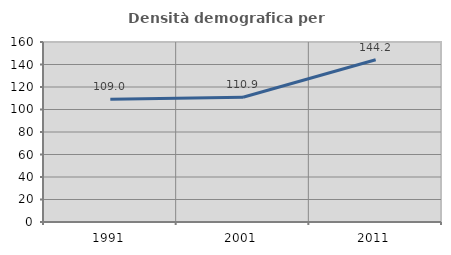
| Category | Densità demografica |
|---|---|
| 1991.0 | 109.007 |
| 2001.0 | 110.874 |
| 2011.0 | 144.167 |